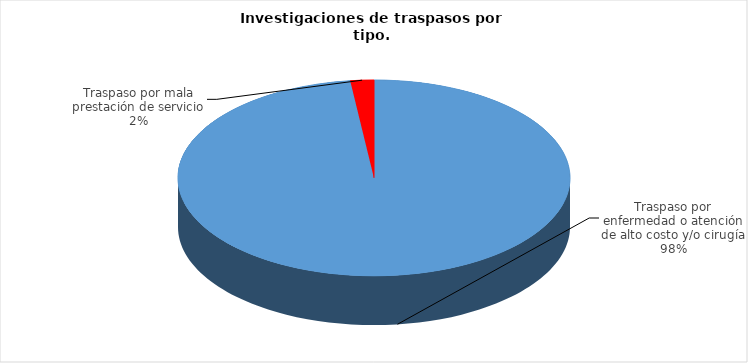
| Category | Series 0 |
|---|---|
| Traspaso por enfermedad o atención de alto costo y/o cirugía | 152 |
| Traspaso por mala prestación de servicio | 3 |